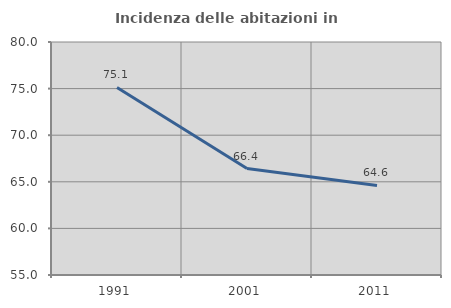
| Category | Incidenza delle abitazioni in proprietà  |
|---|---|
| 1991.0 | 75.127 |
| 2001.0 | 66.418 |
| 2011.0 | 64.607 |